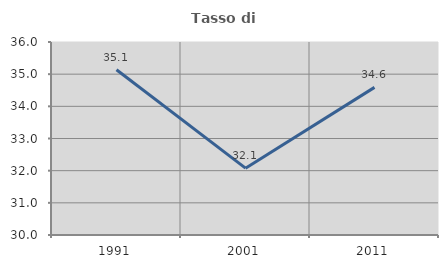
| Category | Tasso di occupazione   |
|---|---|
| 1991.0 | 35.139 |
| 2001.0 | 32.078 |
| 2011.0 | 34.59 |